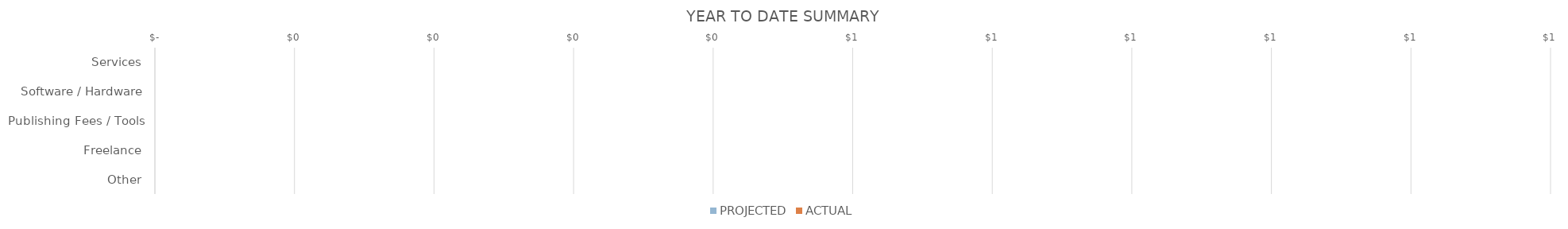
| Category | PROJECTED | ACTUAL |
|---|---|---|
| Services | 0 | 0 |
| Software / Hardware | 0 | 0 |
| Publishing Fees / Tools | 0 | 0 |
| Freelance | 0 | 0 |
| Other | 0 | 0 |